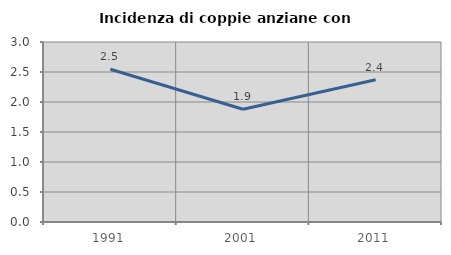
| Category | Incidenza di coppie anziane con figli |
|---|---|
| 1991.0 | 2.545 |
| 2001.0 | 1.88 |
| 2011.0 | 2.372 |